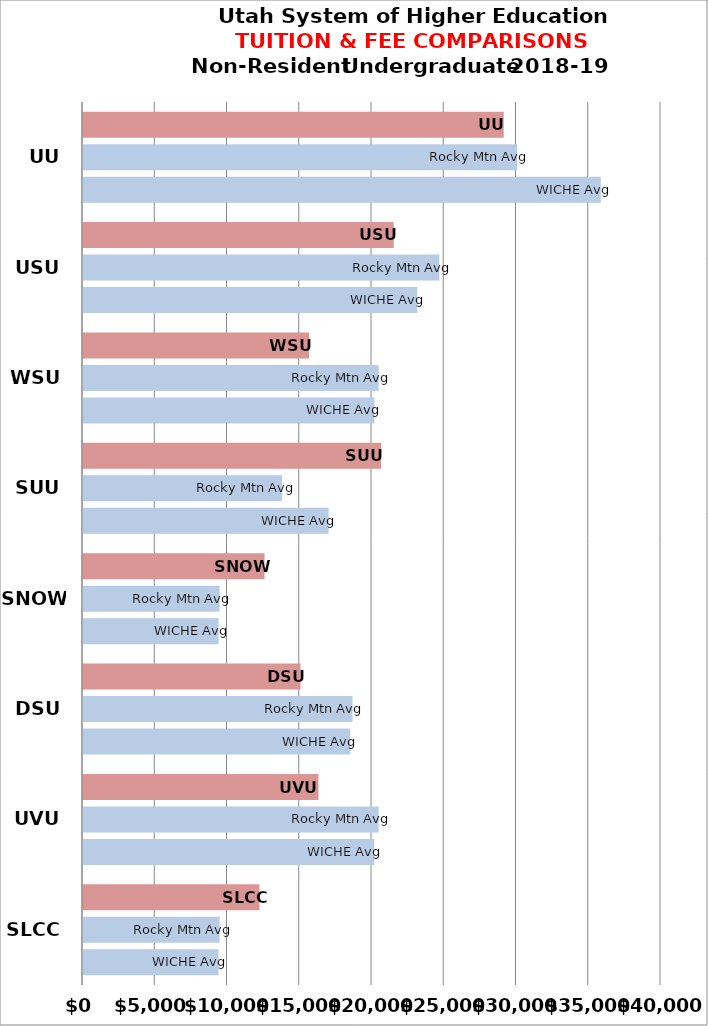
| Category | WICHE Avg | Rocky Mtn Avg | USHE Inst |
|---|---|---|---|
| SLCC | 9383.638 | 9453.423 | 12206 |
| UVU | 20160.9 | 20461.667 | 16296 |
| DSU | 18503 | 18649.364 | 15051 |
| SNOW | 9383.638 | 9453.423 | 12562 |
| SUU | 16998.2 | 13780 | 20632 |
| WSU | 20160.9 | 20461.667 | 15646 |
| USU | 23131.4 | 24660.778 | 21505 |
| UU | 35833.524 | 30049.875 | 29115 |